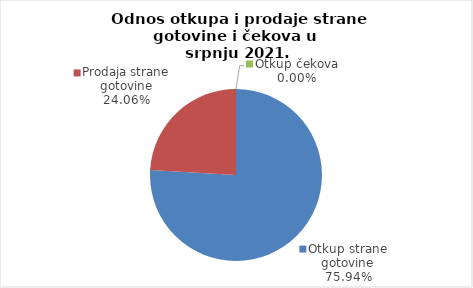
| Category | Series 0 |
|---|---|
| Otkup strane gotovine | 75.936 |
| Prodaja strane gotovine | 24.064 |
| Otkup čekova | 0 |